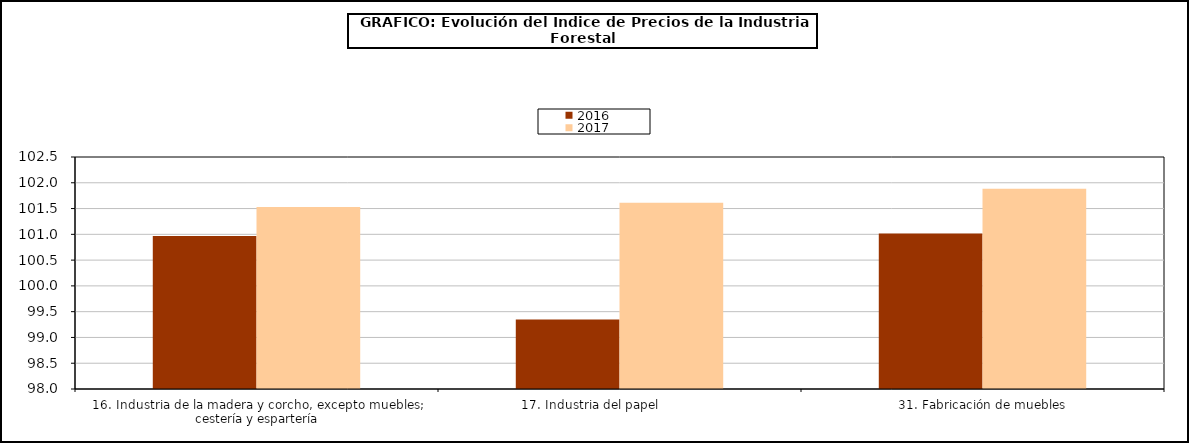
| Category | 2016 | 2017 |
|---|---|---|
| 16. Industria de la madera y corcho, excepto muebles; cestería y espartería | 100.967 | 101.53 |
| 17. Industria del papel                | 99.346 | 101.611 |
| 31. Fabricación de muebles | 101.015 | 101.884 |